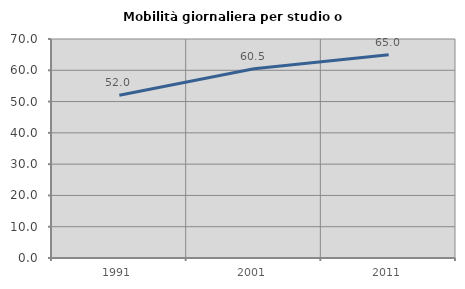
| Category | Mobilità giornaliera per studio o lavoro |
|---|---|
| 1991.0 | 52.047 |
| 2001.0 | 60.484 |
| 2011.0 | 64.952 |